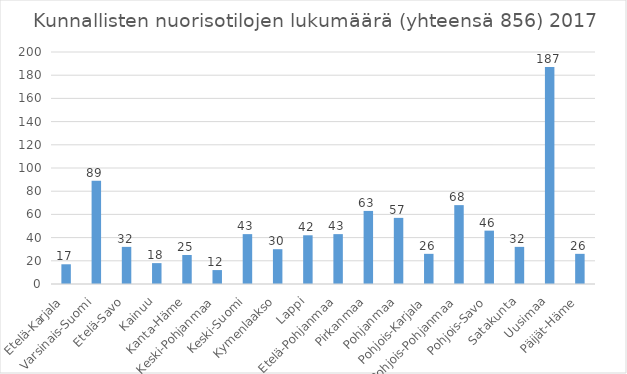
| Category | Kunnallisten nuorisotilojen lukumäärä |
|---|---|
| Etelä-Karjala | 17 |
| Varsinais-Suomi | 89 |
| Etelä-Savo | 32 |
| Kainuu | 18 |
| Kanta-Häme | 25 |
| Keski-Pohjanmaa | 12 |
| Keski-Suomi | 43 |
| Kymenlaakso | 30 |
| Lappi | 42 |
| Etelä-Pohjanmaa | 43 |
| Pirkanmaa | 63 |
| Pohjanmaa | 57 |
| Pohjois-Karjala | 26 |
| Pohjois-Pohjanmaa | 68 |
| Pohjois-Savo | 46 |
| Satakunta | 32 |
| Uusimaa | 187 |
| Päijät-Häme | 26 |